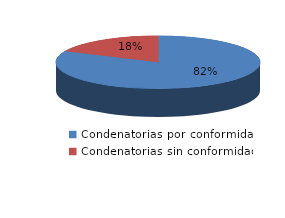
| Category | Series 0 |
|---|---|
| 0 | 36 |
| 1 | 8 |